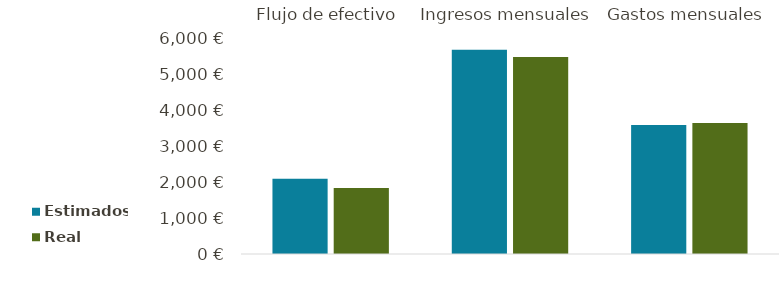
| Category | Estimados | Real |
|---|---|---|
| Flujo de efectivo | 2097 | 1845 |
| Ingresos mensuales | 5700 | 5500 |
| Gastos mensuales | 3603 | 3655 |